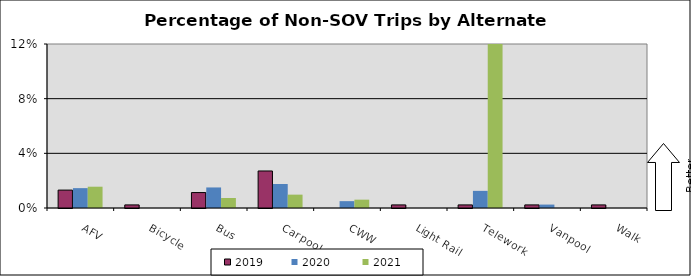
| Category | 2019 | 2020 | 2021 |
|---|---|---|---|
| AFV | 0.013 | 0.015 | 0.016 |
| Bicycle | 0.002 | 0 | 0 |
| Bus | 0.011 | 0.015 | 0.007 |
| Carpool | 0.027 | 0.018 | 0.01 |
| CWW | 0 | 0.005 | 0.006 |
| Light Rail | 0.002 | 0 | 0 |
| Telework | 0.002 | 0.013 | 0.132 |
| Vanpool | 0.002 | 0.003 | 0 |
| Walk | 0.002 | 0 | 0 |